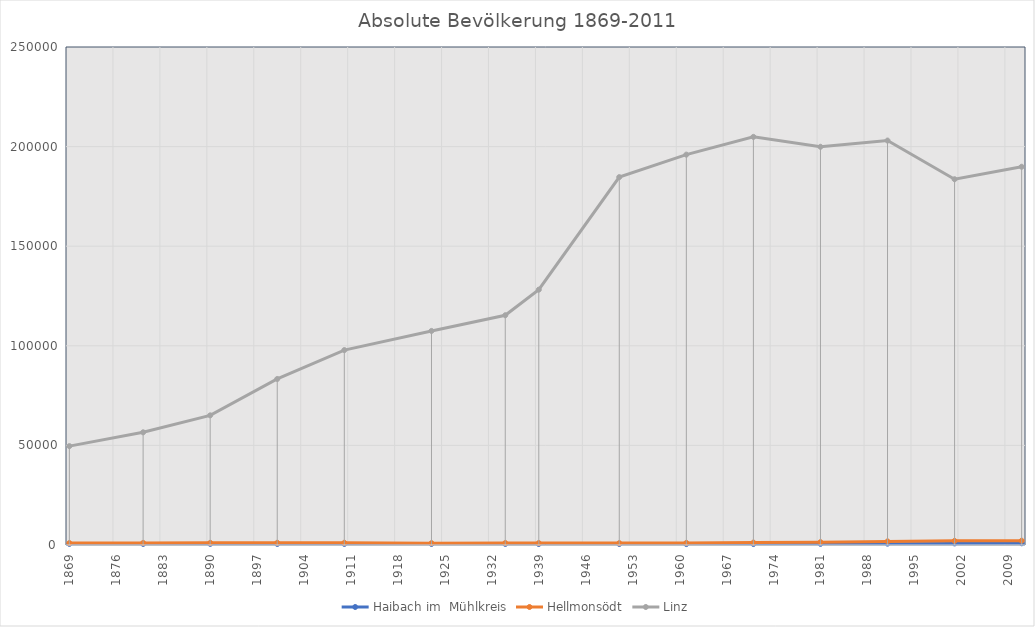
| Category | Haibach im  Mühlkreis | Hellmonsödt | Linz |
|---|---|---|---|
| 2011.0 | 862 | 2160 | 189889 |
| 2001.0 | 783 | 2082 | 183614 |
| 1991.0 | 668 | 1804 | 203044 |
| 1981.0 | 556 | 1433 | 199910 |
| 1971.0 | 477 | 1207 | 204889 |
| 1961.0 | 456 | 1061 | 195978 |
| 1951.0 | 492 | 946 | 184685 |
| 1939.0 | 482 | 977 | 128177 |
| 1934.0 | 526 | 1004 | 115338 |
| 1923.0 | 518 | 930 | 107463 |
| 1910.0 | 528 | 1121 | 97852 |
| 1900.0 | 522 | 1107 | 83356 |
| 1890.0 | 547 | 1080 | 65090 |
| 1880.0 | 531 | 1053 | 56569 |
| 1869.0 | 544 | 979 | 49635 |